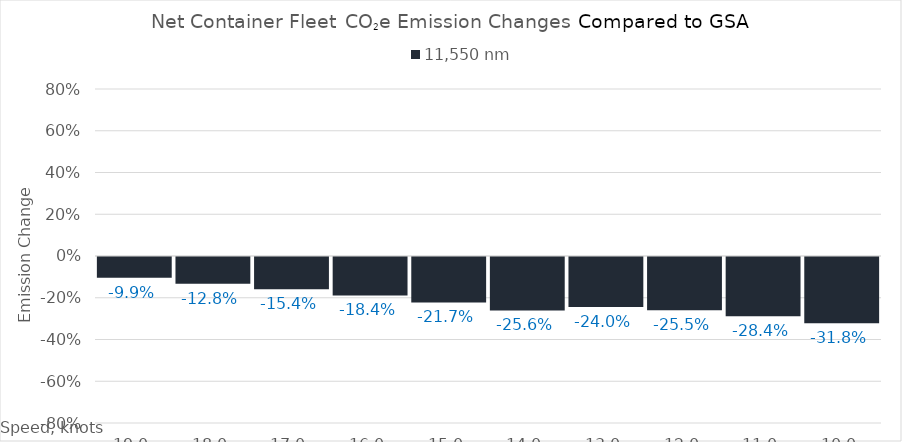
| Category | 11,550 |
|---|---|
| 19.0 | -0.099 |
| 18.0 | -0.128 |
| 17.0 | -0.154 |
| 16.0 | -0.184 |
| 15.0 | -0.217 |
| 14.0 | -0.256 |
| 13.0 | -0.24 |
| 12.0 | -0.255 |
| 11.0 | -0.284 |
| 10.0 | -0.318 |